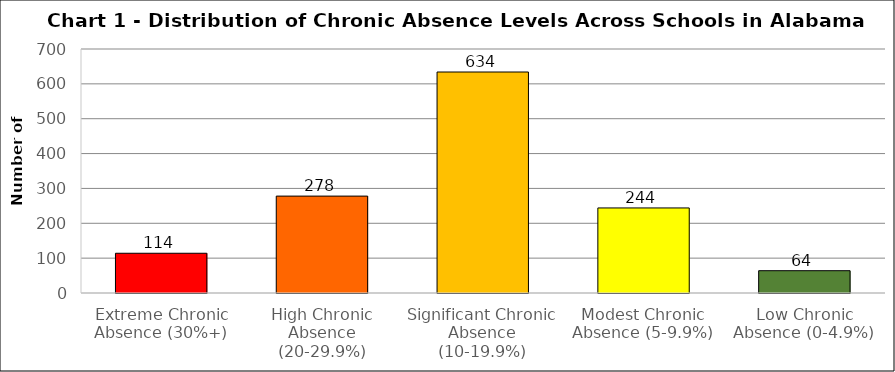
| Category | Series 0 |
|---|---|
| Extreme Chronic Absence (30%+) | 114 |
| High Chronic Absence (20-29.9%) | 278 |
| Significant Chronic Absence (10-19.9%) | 634 |
| Modest Chronic Absence (5-9.9%) | 244 |
| Low Chronic Absence (0-4.9%) | 64 |